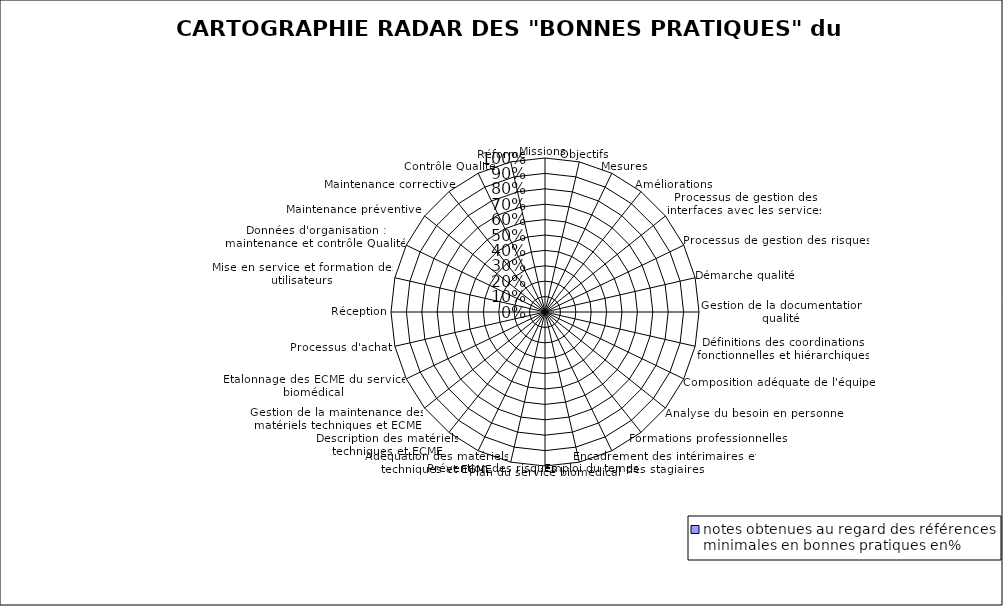
| Category | notes obtenues au regard des références minimales en bonnes pratiques en% |
|---|---|
| Missions | 0 |
| Objectifs | 0 |
| Mesures | 0 |
| Améliorations | 0 |
| Processus de gestion des interfaces avec les services | 0 |
| Processus de gestion des risques | 0 |
| Démarche qualité | 0 |
| Gestion de la documentation qualité | 0 |
| Définitions des coordinations fonctionnelles et hiérarchiques | 0 |
| Composition adéquate de l'équipe | 0 |
| Analyse du besoin en personnel | 0 |
| Formations professionnelles | 0 |
| Encadrement des intérimaires et des stagiaires | 0 |
| Emploi du temps | 0 |
| Plan du service biomédical | 0 |
| Prévention des risques | 0 |
| Adéquation des matériels techniques et ECME | 0 |
| Description des matériels techniques et ECME | 0 |
| Gestion de la maintenance des matériels techniques et ECME | 0 |
| Etalonnage des ECME du service biomédical | 0 |
| Processus d'achat | 0 |
| Réception | 0 |
| Mise en service et formation des utilisateurs | 0 |
| Données d'organisation : maintenance et contrôle Qualité | 0 |
| Maintenance préventive | 0 |
| Maintenance corrective | 0 |
| Contrôle Qualité | 0 |
| Réforme | 0 |